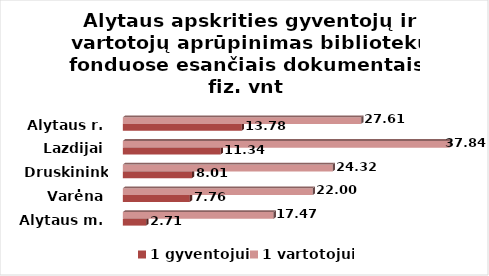
| Category | 1 gyventojui | 1 vartotojui |
|---|---|---|
| Alytaus m. | 2.71 | 17.47 |
| Varėna | 7.76 | 22 |
| Druskininkai | 8.01 | 24.32 |
| Lazdijai | 11.34 | 37.84 |
| Alytaus r. | 13.78 | 27.61 |